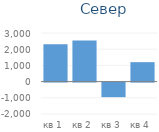
| Category | Север |
|---|---|
| кв 1 | 2300 |
| кв 2 | 2541 |
| кв 3 | -900 |
| кв 4 | 1200 |